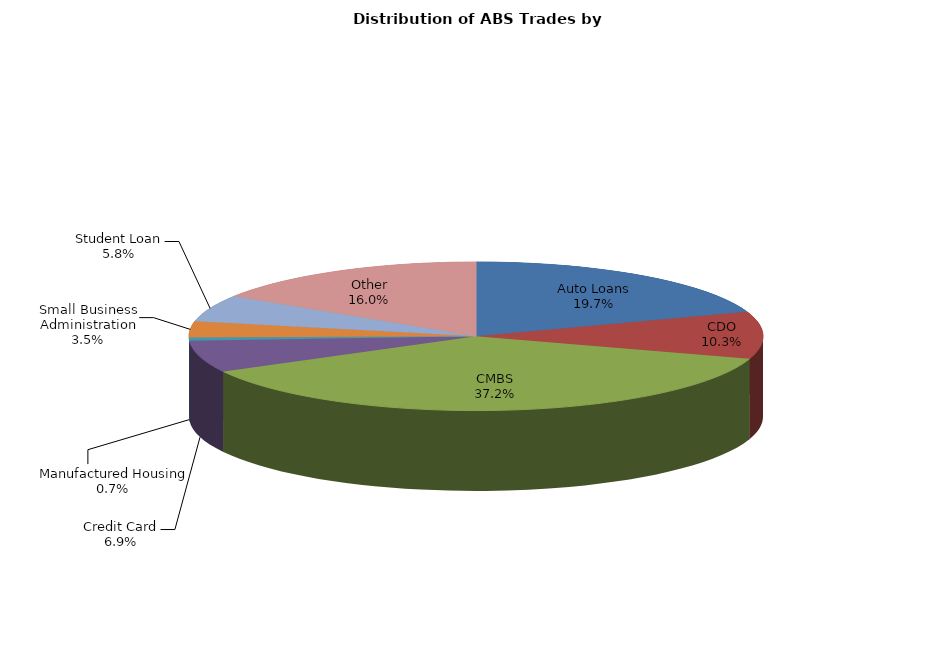
| Category | Series 0 |
|---|---|
| Auto Loans | 137.448 |
| CDO | 71.738 |
| CMBS | 260.179 |
| Credit Card | 48.179 |
| Manufactured Housing | 4.98 |
| Small Business Administration | 24.492 |
| Student Loan | 40.655 |
| Other | 111.544 |